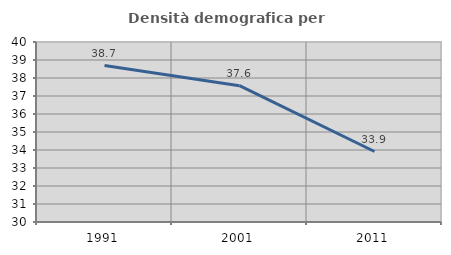
| Category | Densità demografica |
|---|---|
| 1991.0 | 38.688 |
| 2001.0 | 37.571 |
| 2011.0 | 33.916 |